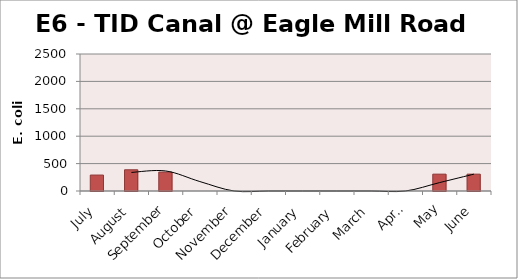
| Category | E. coli MPN |
|---|---|
| July | 290.9 |
| August | 387.3 |
| September | 344.8 |
| October | 0 |
| November | 0 |
| December | 0 |
| January | 0 |
| February | 0 |
| March | 0 |
| April | 0 |
| May | 307.6 |
| June | 307.6 |